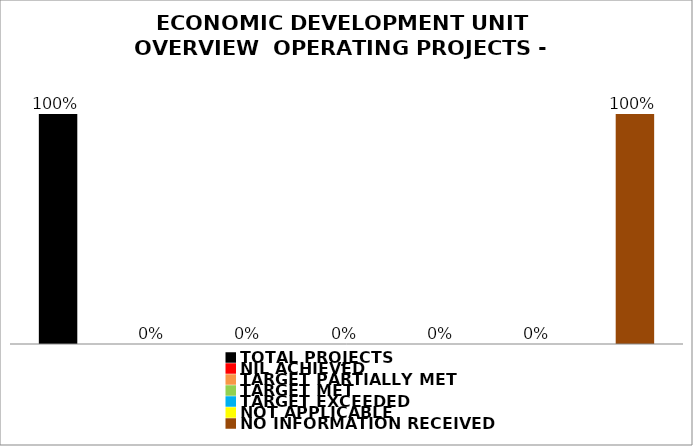
| Category | Series 0 |
|---|---|
| TOTAL PROJECTS | 1 |
| NIL ACHIEVED | 0 |
| TARGET PARTIALLY MET | 0 |
| TARGET MET | 0 |
| TARGET EXCEEDED | 0 |
| NOT APPLICABLE | 0 |
| NO INFORMATION RECEIVED | 1 |